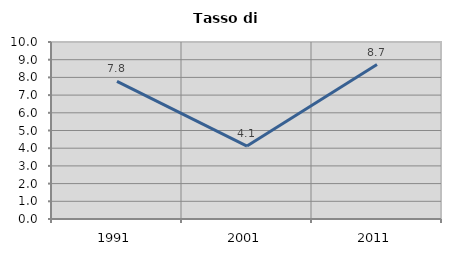
| Category | Tasso di disoccupazione   |
|---|---|
| 1991.0 | 7.774 |
| 2001.0 | 4.12 |
| 2011.0 | 8.724 |